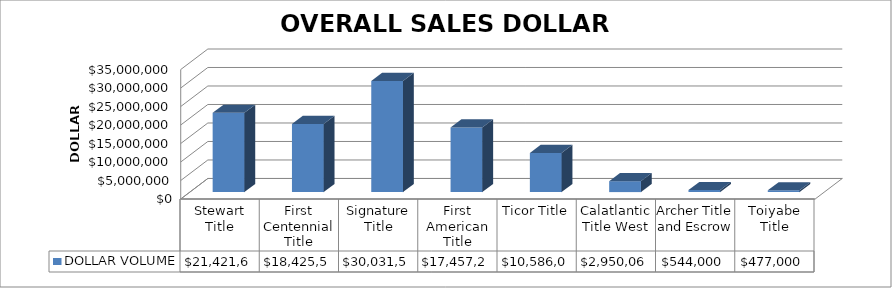
| Category | DOLLAR VOLUME |
|---|---|
| Stewart Title | 21421638 |
| First Centennial Title | 18425500 |
| Signature Title | 30031599 |
| First American Title | 17457232 |
| Ticor Title | 10586075 |
| Calatlantic Title West | 2950065 |
| Archer Title and Escrow | 544000 |
| Toiyabe Title | 477000 |